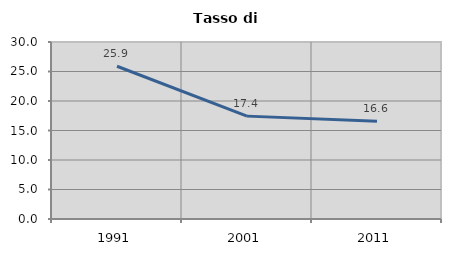
| Category | Tasso di disoccupazione   |
|---|---|
| 1991.0 | 25.89 |
| 2001.0 | 17.436 |
| 2011.0 | 16.551 |